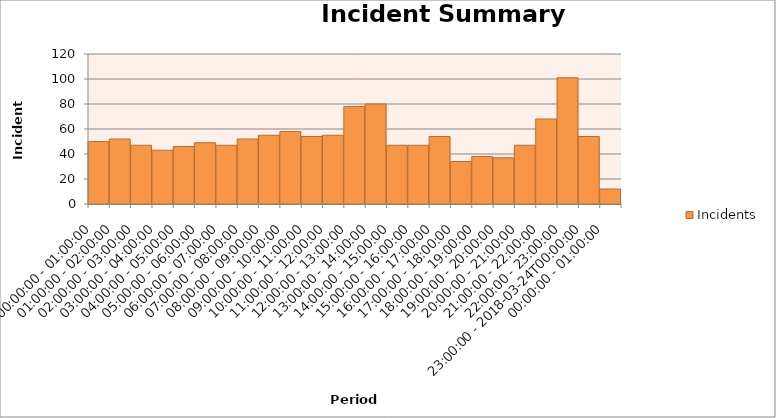
| Category | Incidents |
|---|---|
| 00:00:00 - 01:00:00 | 50 |
| 01:00:00 - 02:00:00 | 52 |
| 02:00:00 - 03:00:00 | 47 |
| 03:00:00 - 04:00:00 | 43 |
| 04:00:00 - 05:00:00 | 46 |
| 05:00:00 - 06:00:00 | 49 |
| 06:00:00 - 07:00:00 | 47 |
| 07:00:00 - 08:00:00 | 52 |
| 08:00:00 - 09:00:00 | 55 |
| 09:00:00 - 10:00:00 | 58 |
| 10:00:00 - 11:00:00 | 54 |
| 11:00:00 - 12:00:00 | 55 |
| 12:00:00 - 13:00:00 | 78 |
| 13:00:00 - 14:00:00 | 80 |
| 14:00:00 - 15:00:00 | 47 |
| 15:00:00 - 16:00:00 | 47 |
| 16:00:00 - 17:00:00 | 54 |
| 17:00:00 - 18:00:00 | 34 |
| 18:00:00 - 19:00:00 | 38 |
| 19:00:00 - 20:00:00 | 37 |
| 20:00:00 - 21:00:00 | 47 |
| 21:00:00 - 22:00:00 | 68 |
| 22:00:00 - 23:00:00 | 101 |
| 23:00:00 - 2018-03-24T00:00:00 | 54 |
| 00:00:00 - 01:00:00 | 12 |